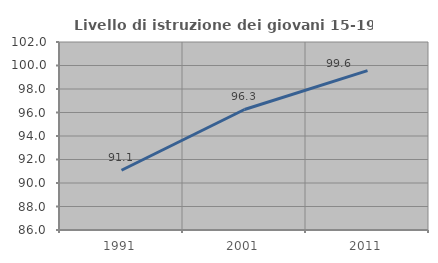
| Category | Livello di istruzione dei giovani 15-19 anni |
|---|---|
| 1991.0 | 91.085 |
| 2001.0 | 96.257 |
| 2011.0 | 99.565 |